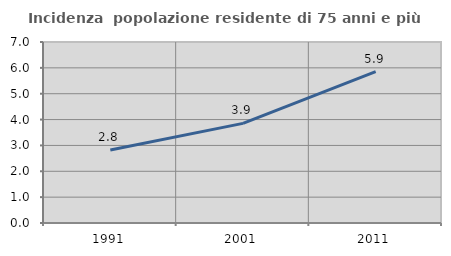
| Category | Incidenza  popolazione residente di 75 anni e più |
|---|---|
| 1991.0 | 2.822 |
| 2001.0 | 3.854 |
| 2011.0 | 5.854 |